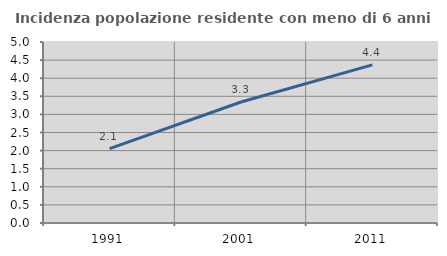
| Category | Incidenza popolazione residente con meno di 6 anni |
|---|---|
| 1991.0 | 2.054 |
| 2001.0 | 3.342 |
| 2011.0 | 4.368 |